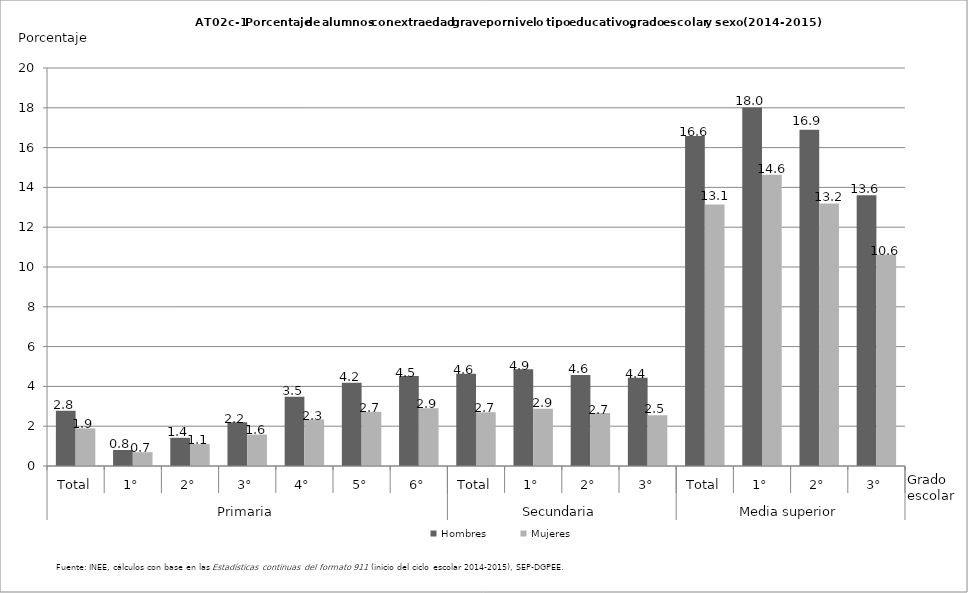
| Category | Hombres | Mujeres |
|---|---|---|
| 0 | 2.771 | 1.89 |
| 1 | 0.805 | 0.694 |
| 2 | 1.417 | 1.102 |
| 3 | 2.204 | 1.579 |
| 4 | 3.478 | 2.339 |
| 5 | 4.181 | 2.726 |
| 6 | 4.528 | 2.897 |
| 7 | 4.637 | 2.706 |
| 8 | 4.86 | 2.88 |
| 9 | 4.579 | 2.667 |
| 10 | 4.434 | 2.549 |
| 11 | 16.577 | 13.143 |
| 12 | 18.019 | 14.639 |
| 13 | 16.893 | 13.197 |
| 14 | 13.607 | 10.623 |